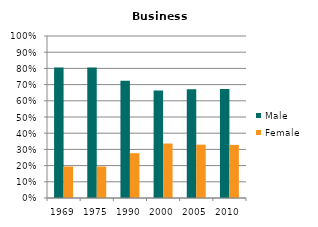
| Category | Male | Female |
|---|---|---|
| 1969.0 | 0.806 | 0.194 |
| 1975.0 | 0.806 | 0.194 |
| 1990.0 | 0.723 | 0.277 |
| 2000.0 | 0.664 | 0.336 |
| 2005.0 | 0.671 | 0.329 |
| 2010.0 | 0.672 | 0.328 |